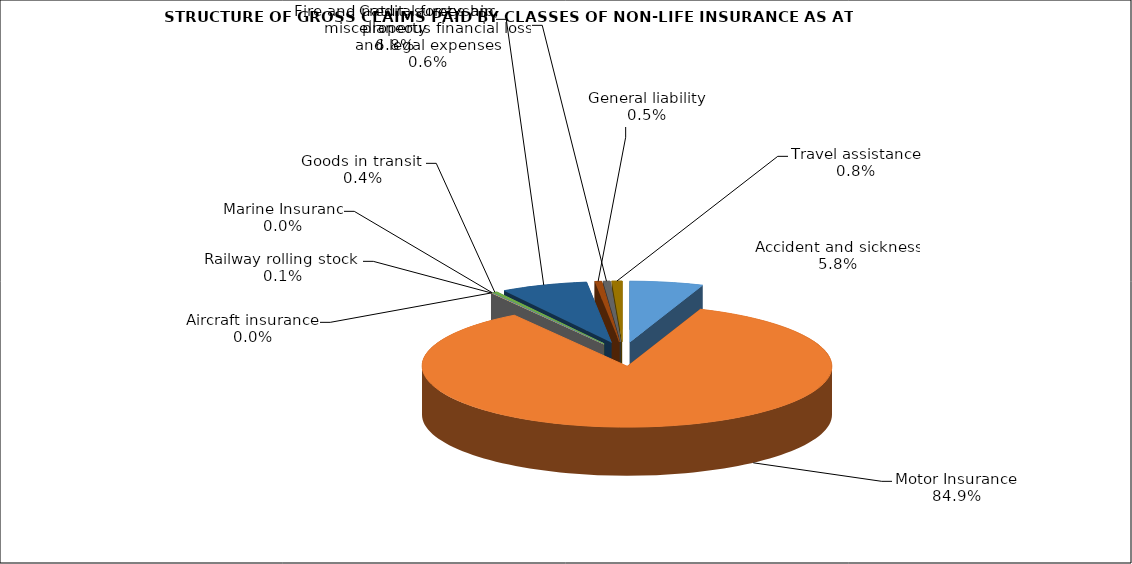
| Category | Accident and sickness | Series 1 |
|---|---|---|
| Accident and sickness | 0.058 | 0.061 |
| Motor Insurance | 0.849 | 0.871 |
| Railway rolling stock  | 0.001 | 0.001 |
| Aircraft insurance | 0 | 0 |
| Marine Insuranc | 0 | 0.001 |
| Goods in transit  | 0.004 | 0 |
| Fire and natural forces and property | 0.068 | 0.05 |
| General liability | 0.005 | 0.005 |
| Credit, suretyship, miscellaneous financial loss and legal expenses | 0.006 | 0.003 |
| Travel assistance | 0.008 | 0.008 |